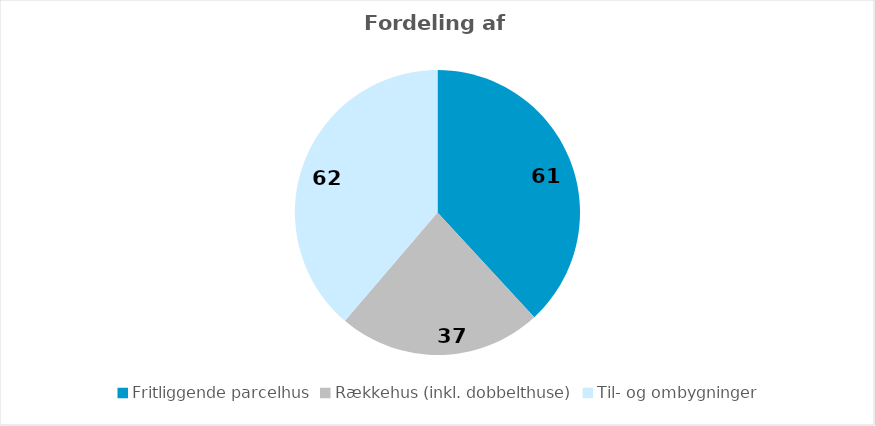
| Category | Series 0 | Series 1 |
|---|---|---|
| Fritliggende parcelhus | 61 | 0.381 |
| Rækkehus (inkl. dobbelthuse) | 37 | 0.231 |
| Til- og ombygninger | 62 | 0.388 |